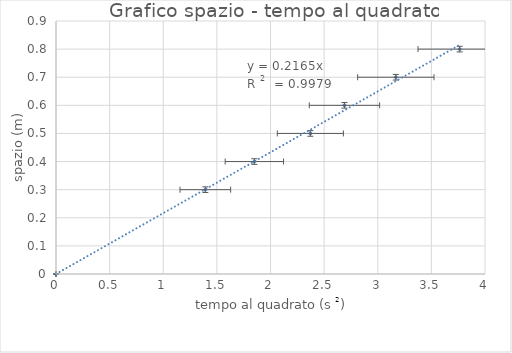
| Category | Series 0 |
|---|---|
| 0.0 | 0 |
| 1.3924000000000003 | 0.3 |
| 1.8495999999999997 | 0.4 |
| 2.3716 | 0.5 |
| 2.6895999999999995 | 0.6 |
| 3.1684 | 0.7 |
| 3.7636 | 0.8 |